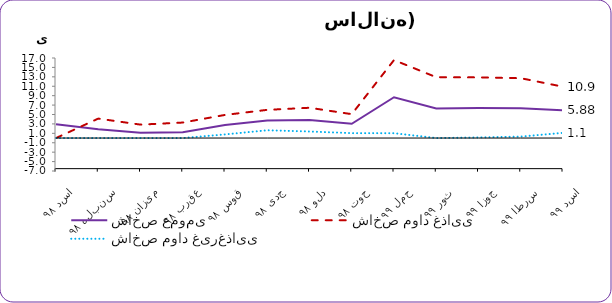
| Category | شاخص عمومی  | شاخص مواد غذایی | شاخص مواد غیرغذایی | 2.35 1.00 0.78 0.24- |
|---|---|---|---|---|
| اسد ۹۸ | 2.92 | 0 | 0 |  |
| سنبله ۹۸ | 1.85 | 4.13 | 0 |  |
| میزان ۹۸ | 1.12 | 2.85 | 0 |  |
| عقرب ۹۸ | 1.22 | 3.29 | 0 |  |
| قوس ۹۸ | 2.77 | 4.91 | 0.77 |  |
| جدی ۹۸ | 3.75 | 5.985 | 1.65 |  |
| دلو ۹۸ | 3.84 | 6.43 | 1.39 |  |
| حوت ۹۸ | 3.02 | 5.07 | 1.04 |  |
| حمل ۹۹ | 8.67 | 16.56 | 1.03 |  |
| ثور ۹۹ | 6.26 | 12.92 | 0 |  |
| جوزا ۹۹ | 6.36 | 12.88 | 0.13 |  |
| سرطا ۹۹ | 6.33 | 12.71 | 0.31 |  |
| اسد ۹۹ | 5.88 | 10.9 | 1.1 |  |